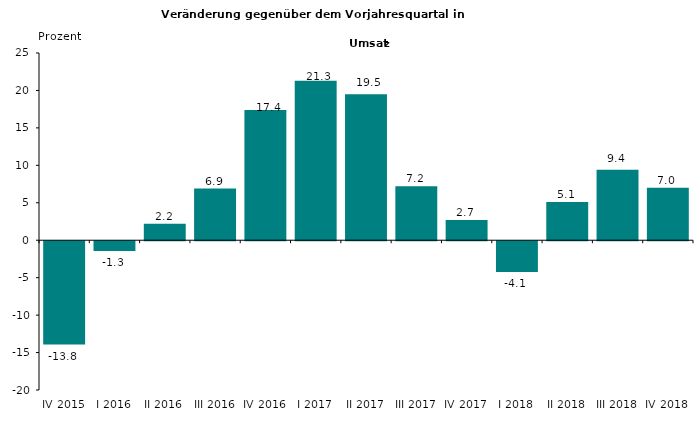
| Category | -13,8 -1,3 2,2 6,9 17,4 21,3 19,5 7,2 2,7 -4,1 5,1 9,4 7 |
|---|---|
| IV 2015 | -13.8 |
| I 2016 | -1.3 |
| II 2016 | 2.2 |
| III 2016 | 6.9 |
| IV 2016 | 17.4 |
| I 2017 | 21.3 |
| II 2017 | 19.5 |
| III 2017 | 7.2 |
| IV 2017 | 2.7 |
| I 2018 | -4.1 |
| II 2018 | 5.1 |
| III 2018 | 9.4 |
| IV 2018 | 7 |